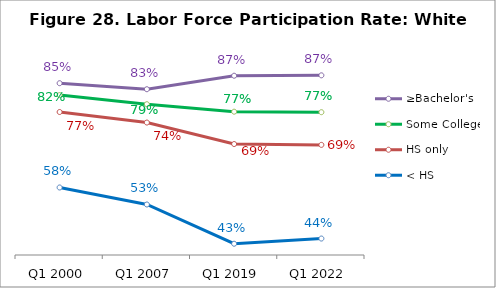
| Category | ≥Bachelor's | Some College | HS only | < HS |
|---|---|---|---|---|
| Q1 2000 | 0.846 | 0.815 | 0.771 | 0.575 |
| Q1 2007 | 0.831 | 0.792 | 0.744 | 0.531 |
| Q1 2019 | 0.866 | 0.772 | 0.688 | 0.429 |
| Q1 2022 | 0.867 | 0.771 | 0.686 | 0.443 |